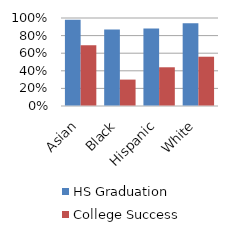
| Category | HS Graduation | College Success |
|---|---|---|
| Asian | 0.98 | 0.69 |
| Black | 0.87 | 0.3 |
| Hispanic | 0.88 | 0.44 |
| White | 0.94 | 0.56 |